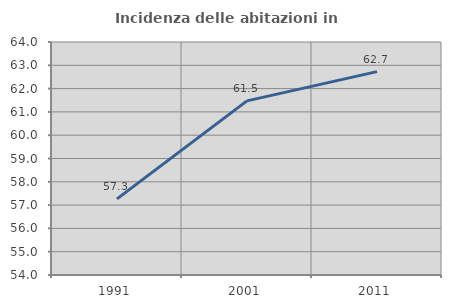
| Category | Incidenza delle abitazioni in proprietà  |
|---|---|
| 1991.0 | 57.268 |
| 2001.0 | 61.474 |
| 2011.0 | 62.729 |